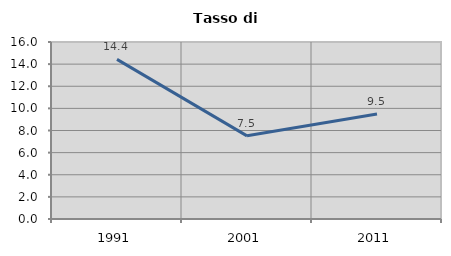
| Category | Tasso di disoccupazione   |
|---|---|
| 1991.0 | 14.431 |
| 2001.0 | 7.518 |
| 2011.0 | 9.49 |